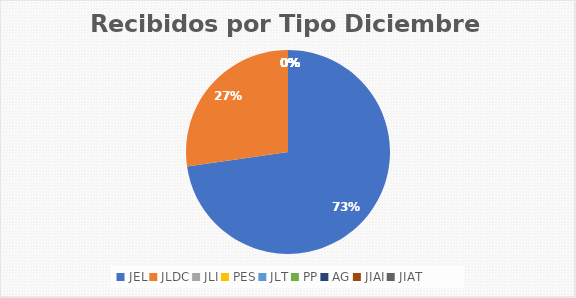
| Category | Series 0 |
|---|---|
| JEL | 8 |
| JLDC | 3 |
| JLI | 0 |
| PES | 0 |
| JLT | 0 |
| PP | 0 |
| AG | 0 |
| JIAI | 0 |
| JIAT | 0 |